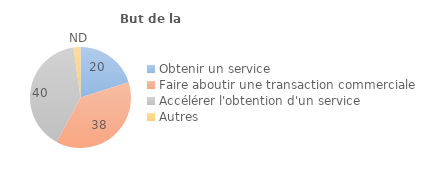
| Category | part |
|---|---|
| Obtenir un service | 20.078 |
| Faire aboutir une transaction commerciale | 37.706 |
| Accélérer l'obtention d'un service | 40.006 |
| Autres | 2.21 |